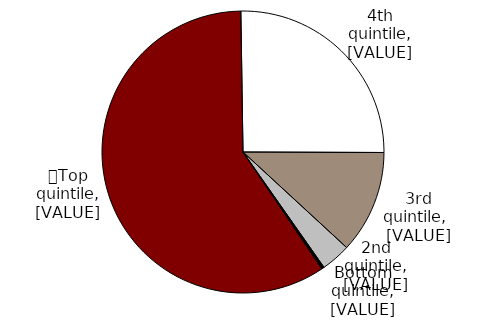
| Category | Series 0 |
|---|---|
| 0 | 0.592 |
| 1 | 0.253 |
| 2 | 0.118 |
| 3 | 0.034 |
| 4 | 0.003 |